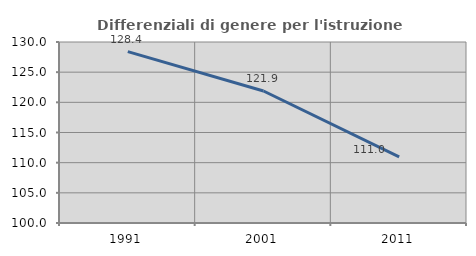
| Category | Differenziali di genere per l'istruzione superiore |
|---|---|
| 1991.0 | 128.401 |
| 2001.0 | 121.875 |
| 2011.0 | 110.974 |